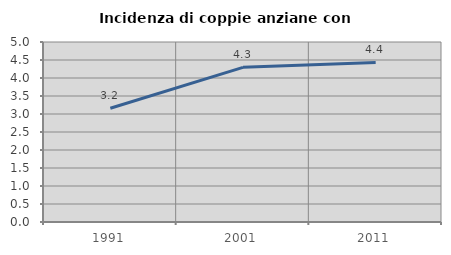
| Category | Incidenza di coppie anziane con figli |
|---|---|
| 1991.0 | 3.16 |
| 2001.0 | 4.296 |
| 2011.0 | 4.433 |